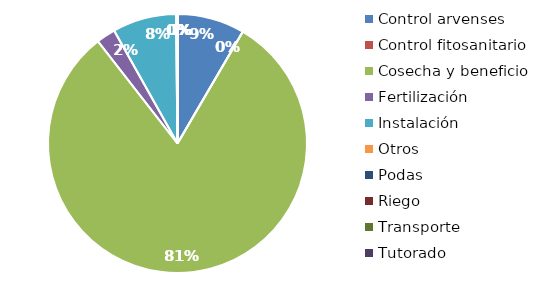
| Category | Valor |
|---|---|
| Control arvenses | 7910000 |
| Control fitosanitario | 0 |
| Cosecha y beneficio | 76272000 |
| Fertilización | 2240000 |
| Instalación | 7490000 |
| Otros | 175000 |
| Podas | 0 |
| Riego | 0 |
| Transporte | 0 |
| Tutorado | 0 |